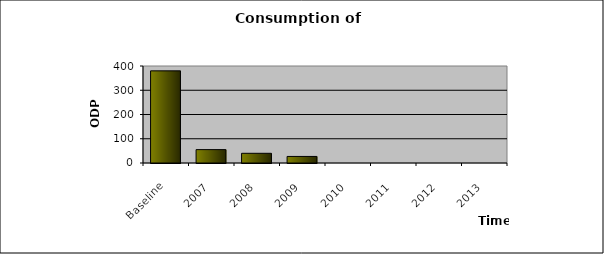
| Category | Series 0 |
|---|---|
| Baseline | 380 |
| 2007 | 55.2 |
| 2008 | 40 |
| 2009 | 27 |
| 2010 | 0 |
| 2011 | 0 |
| 2012 | 0 |
| 2013 | 0 |